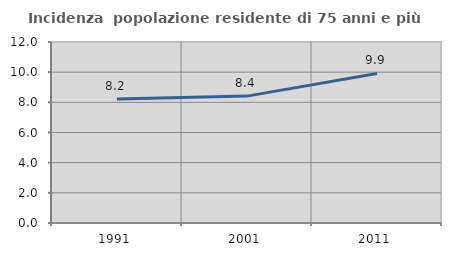
| Category | Incidenza  popolazione residente di 75 anni e più |
|---|---|
| 1991.0 | 8.215 |
| 2001.0 | 8.412 |
| 2011.0 | 9.915 |